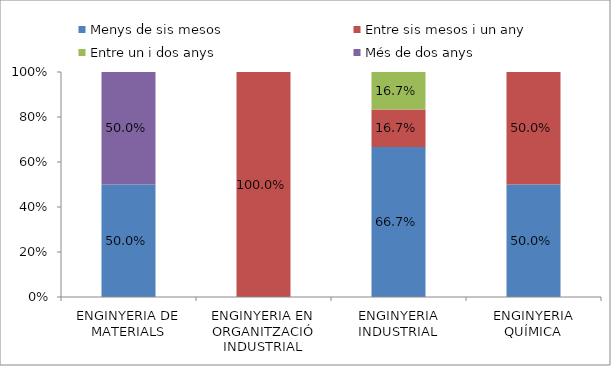
| Category | Menys de sis mesos | Entre sis mesos i un any | Entre un i dos anys | Més de dos anys |
|---|---|---|---|---|
| ENGINYERIA DE MATERIALS | 0.5 | 0 | 0 | 0.5 |
| ENGINYERIA EN ORGANITZACIÓ INDUSTRIAL | 0 | 1 | 0 | 0 |
| ENGINYERIA INDUSTRIAL | 0.667 | 0.167 | 0.167 | 0 |
| ENGINYERIA QUÍMICA | 0.5 | 0.5 | 0 | 0 |